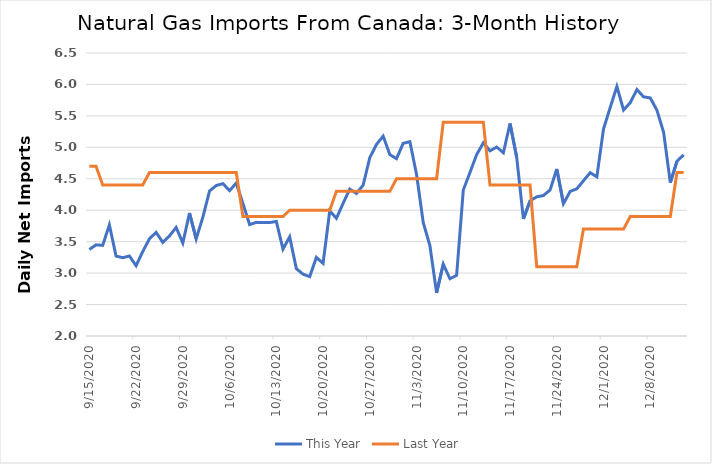
| Category | This Year | Last Year |
|---|---|---|
| 9/15/20 | 3.375 | 4.7 |
| 9/16/20 | 3.449 | 4.7 |
| 9/17/20 | 3.442 | 4.4 |
| 9/18/20 | 3.767 | 4.4 |
| 9/19/20 | 3.27 | 4.4 |
| 9/20/20 | 3.245 | 4.4 |
| 9/21/20 | 3.272 | 4.4 |
| 9/22/20 | 3.118 | 4.4 |
| 9/23/20 | 3.344 | 4.4 |
| 9/24/20 | 3.545 | 4.6 |
| 9/25/20 | 3.648 | 4.6 |
| 9/26/20 | 3.488 | 4.6 |
| 9/27/20 | 3.591 | 4.6 |
| 9/28/20 | 3.726 | 4.6 |
| 9/29/20 | 3.479 | 4.6 |
| 9/30/20 | 3.955 | 4.6 |
| 10/1/20 | 3.544 | 4.6 |
| 10/2/20 | 3.89 | 4.6 |
| 10/3/20 | 4.306 | 4.6 |
| 10/4/20 | 4.392 | 4.6 |
| 10/5/20 | 4.423 | 4.6 |
| 10/6/20 | 4.311 | 4.6 |
| 10/7/20 | 4.433 | 4.6 |
| 10/8/20 | 4.106 | 3.9 |
| 10/9/20 | 3.771 | 3.9 |
| 10/10/20 | 3.807 | 3.9 |
| 10/11/20 | 3.805 | 3.9 |
| 10/12/20 | 3.804 | 3.9 |
| 10/13/20 | 3.822 | 3.9 |
| 10/14/20 | 3.381 | 3.9 |
| 10/15/20 | 3.577 | 4 |
| 10/16/20 | 3.07 | 4 |
| 10/17/20 | 2.983 | 4 |
| 10/18/20 | 2.944 | 4 |
| 10/19/20 | 3.251 | 4 |
| 10/20/20 | 3.155 | 4 |
| 10/21/20 | 3.99 | 4 |
| 10/22/20 | 3.871 | 4.3 |
| 10/23/20 | 4.109 | 4.3 |
| 10/24/20 | 4.337 | 4.3 |
| 10/25/20 | 4.266 | 4.3 |
| 10/26/20 | 4.398 | 4.3 |
| 10/27/20 | 4.837 | 4.3 |
| 10/28/20 | 5.046 | 4.3 |
| 10/29/20 | 5.178 | 4.3 |
| 10/30/20 | 4.885 | 4.3 |
| 10/31/20 | 4.82 | 4.5 |
| 11/1/20 | 5.064 | 4.5 |
| 11/2/20 | 5.09 | 4.5 |
| 11/3/20 | 4.57 | 4.5 |
| 11/4/20 | 3.805 | 4.5 |
| 11/5/20 | 3.437 | 4.5 |
| 11/6/20 | 2.685 | 4.5 |
| 11/7/20 | 3.142 | 5.4 |
| 11/8/20 | 2.91 | 5.4 |
| 11/9/20 | 2.965 | 5.4 |
| 11/10/20 | 4.32 | 5.4 |
| 11/11/20 | 4.6 | 5.4 |
| 11/12/20 | 4.885 | 5.4 |
| 11/13/20 | 5.071 | 5.4 |
| 11/14/20 | 4.944 | 4.4 |
| 11/15/20 | 5.006 | 4.4 |
| 11/16/20 | 4.913 | 4.4 |
| 11/17/20 | 5.38 | 4.4 |
| 11/18/20 | 4.841 | 4.4 |
| 11/19/20 | 3.862 | 4.4 |
| 11/20/20 | 4.149 | 4.4 |
| 11/21/20 | 4.213 | 3.1 |
| 11/22/20 | 4.233 | 3.1 |
| 11/23/20 | 4.323 | 3.1 |
| 11/24/20 | 4.656 | 3.1 |
| 11/25/20 | 4.105 | 3.1 |
| 11/26/20 | 4.299 | 3.1 |
| 11/27/20 | 4.34 | 3.1 |
| 11/28/20 | 4.469 | 3.7 |
| 11/29/20 | 4.597 | 3.7 |
| 11/30/20 | 4.531 | 3.7 |
| 12/1/20 | 5.292 | 3.7 |
| 12/2/20 | 5.633 | 3.7 |
| 12/3/20 | 5.968 | 3.7 |
| 12/4/20 | 5.593 | 3.7 |
| 12/5/20 | 5.71 | 3.9 |
| 12/6/20 | 5.92 | 3.9 |
| 12/7/20 | 5.803 | 3.9 |
| 12/8/20 | 5.786 | 3.9 |
| 12/9/20 | 5.589 | 3.9 |
| 12/10/20 | 5.238 | 3.9 |
| 12/11/20 | 4.439 | 3.9 |
| 12/12/20 | 4.779 | 4.6 |
| 12/13/20 | 4.881 | 4.6 |